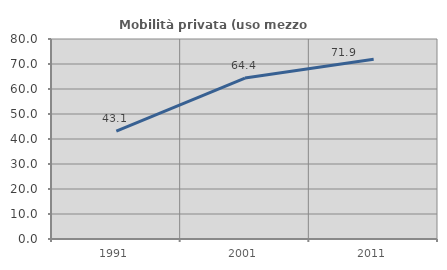
| Category | Mobilità privata (uso mezzo privato) |
|---|---|
| 1991.0 | 43.11 |
| 2001.0 | 64.358 |
| 2011.0 | 71.901 |